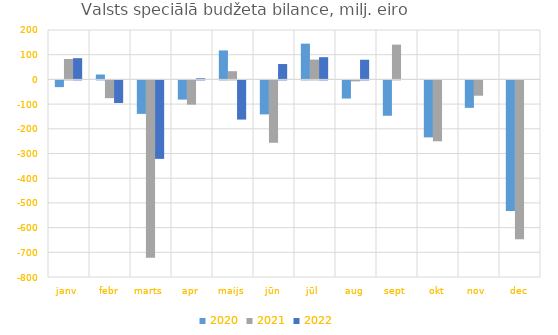
| Category | 2020 | 2021 | 2022 |
|---|---|---|---|
| janv | -27208.622 | 82687.376 | 85977.566 |
| febr | 19788.686 | -71897.87 | -91449.582 |
| marts | -135656.538 | -718456.648 | -317726.304 |
| apr | -77693.159 | -98266.92 | 4462.198 |
| maijs | 117283.375 | 33166.776 | -158594.854 |
| jūn | -137664.742 | -252544.202 | 62199.471 |
| jūl | 144716.055 | 80130.309 | 89874.872 |
| aug | -73544.568 | -3849.803 | 79584.039 |
| sept | -143217.051 | 140699.512 | 0 |
| okt | -230687.141 | -246404.654 | 0 |
| nov | -111188.747 | -62022.59 | 0 |
| dec | -529219.01 | -643593.594 | 0 |